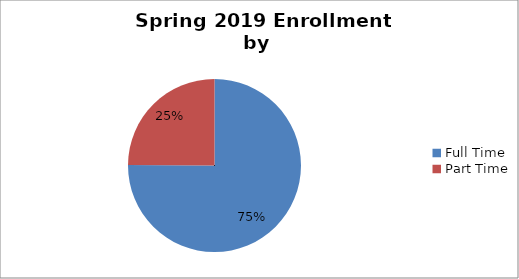
| Category | Series 0 |
|---|---|
| Full Time | 1235 |
| Part Time | 410 |